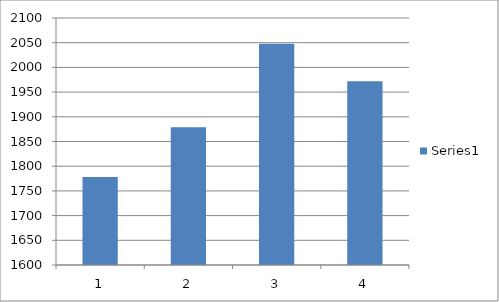
| Category | Series 0 |
|---|---|
| 0 | 1778 |
| 1 | 1879 |
| 2 | 2048 |
| 3 | 1972 |